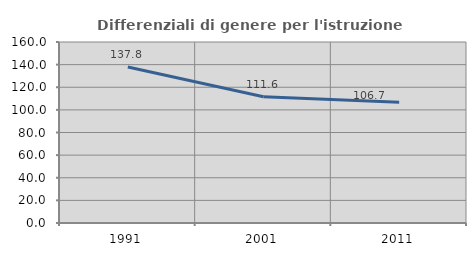
| Category | Differenziali di genere per l'istruzione superiore |
|---|---|
| 1991.0 | 137.837 |
| 2001.0 | 111.601 |
| 2011.0 | 106.669 |